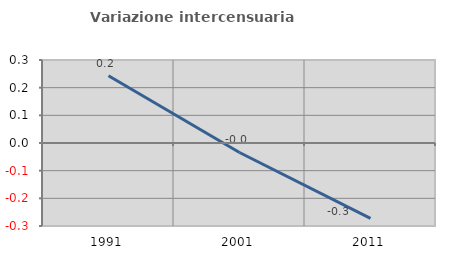
| Category | Variazione intercensuaria annua |
|---|---|
| 1991.0 | 0.243 |
| 2001.0 | -0.034 |
| 2011.0 | -0.272 |